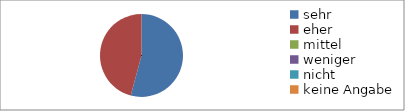
| Category | Series 0 |
|---|---|
| sehr | 13 |
| eher | 11 |
| mittel | 0 |
| weniger | 0 |
| nicht | 0 |
| keine Angabe | 0 |